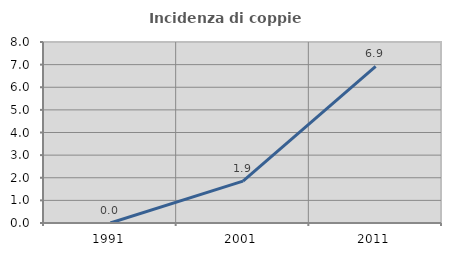
| Category | Incidenza di coppie miste |
|---|---|
| 1991.0 | 0 |
| 2001.0 | 1.852 |
| 2011.0 | 6.923 |